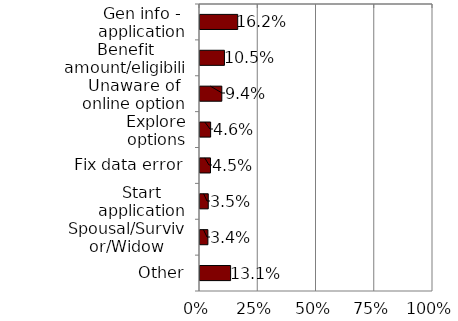
| Category | Series 0 |
|---|---|
| Gen info - application process | 0.162 |
| Benefit amount/eligibility | 0.105 |
| Unaware of online option | 0.094 |
| Explore options | 0.046 |
| Fix data error | 0.045 |
| Start application | 0.035 |
| Spousal/Survivor/Widow | 0.034 |
| Other | 0.131 |